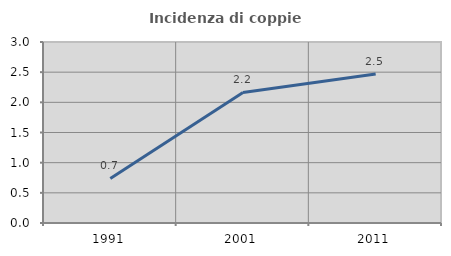
| Category | Incidenza di coppie miste |
|---|---|
| 1991.0 | 0.738 |
| 2001.0 | 2.163 |
| 2011.0 | 2.47 |